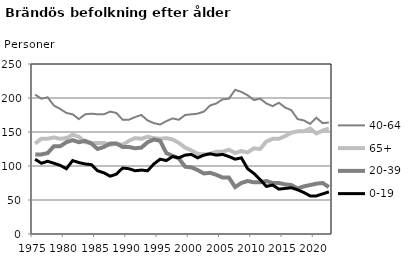
| Category | 40-64 | 65+ | 20-39 | 0-19 |
|---|---|---|---|---|
| 1975.0 | 205 | 133 | 117 | 110 |
| 1976.0 | 199 | 140 | 117 | 104 |
| 1977.0 | 201 | 140 | 119 | 107 |
| 1978.0 | 189 | 142 | 129 | 104 |
| 1979.0 | 184 | 140 | 129 | 101 |
| 1980.0 | 178 | 141 | 135 | 96 |
| 1981.0 | 176 | 146 | 138 | 108 |
| 1982.0 | 169 | 143 | 135 | 105 |
| 1983.0 | 176 | 135 | 137 | 103 |
| 1984.0 | 177 | 134 | 133 | 102 |
| 1985.0 | 176 | 134 | 125 | 93 |
| 1986.0 | 176 | 134 | 128 | 90 |
| 1987.0 | 180 | 131 | 133 | 85 |
| 1988.0 | 178 | 133 | 133 | 88 |
| 1989.0 | 168 | 131 | 128 | 97 |
| 1990.0 | 168 | 137 | 128 | 96 |
| 1991.0 | 172 | 141 | 126 | 93 |
| 1992.0 | 175 | 140 | 127 | 94 |
| 1993.0 | 167 | 143 | 135 | 93 |
| 1994.0 | 163 | 141 | 139 | 103 |
| 1995.0 | 161 | 140 | 137 | 110 |
| 1996.0 | 166 | 141 | 119 | 108 |
| 1997.0 | 170 | 139 | 115 | 114 |
| 1998.0 | 168 | 134 | 111 | 112 |
| 1999.0 | 175 | 127 | 99 | 116 |
| 2000.0 | 176 | 123 | 98 | 117 |
| 2001.0 | 177 | 118 | 94 | 112 |
| 2002.0 | 180 | 117 | 89 | 116 |
| 2003.0 | 189 | 118 | 90 | 118 |
| 2004.0 | 192 | 121 | 87 | 116 |
| 2005.0 | 198 | 121 | 83 | 117 |
| 2006.0 | 199 | 124 | 83 | 114 |
| 2007.0 | 212 | 119 | 69 | 110 |
| 2008.0 | 209 | 122 | 75 | 112 |
| 2009.0 | 204 | 120 | 78 | 96 |
| 2010.0 | 197 | 126 | 76 | 89 |
| 2011.0 | 199 | 125 | 76 | 80 |
| 2012.0 | 192 | 136 | 78 | 70 |
| 2013.0 | 188 | 140 | 75 | 72 |
| 2014.0 | 193 | 140 | 75 | 66 |
| 2015.0 | 186 | 144 | 73 | 67 |
| 2016.0 | 182 | 149 | 72 | 68 |
| 2017.0 | 169 | 151 | 67 | 65 |
| 2018.0 | 167 | 151 | 70 | 61 |
| 2019.0 | 162 | 155 | 72 | 56 |
| 2020.0 | 171 | 148 | 74 | 56 |
| 2021.0 | 163 | 152 | 75 | 59 |
| 2022.0 | 164 | 155 | 69 | 62 |